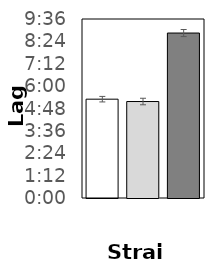
| Category | Series 0 |
|---|---|
| 0 | 0.221 |
| 1 | 0.216 |
| 2 | 0.369 |